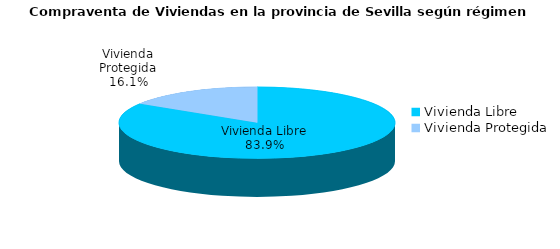
| Category | Series 0 | Series 1 |
|---|---|---|
| Vivienda Libre | 840 | 0.839 |
| Vivienda Protegida | 161 | 0.161 |